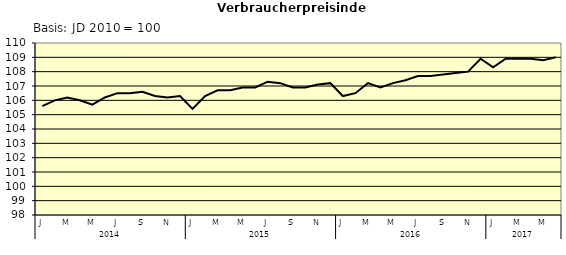
| Category | Series 0 |
|---|---|
| 0 | 105.6 |
| 1 | 106 |
| 2 | 106.2 |
| 3 | 106 |
| 4 | 105.7 |
| 5 | 106.2 |
| 6 | 106.5 |
| 7 | 106.5 |
| 8 | 106.6 |
| 9 | 106.3 |
| 10 | 106.2 |
| 11 | 106.3 |
| 12 | 105.4 |
| 13 | 106.3 |
| 14 | 106.7 |
| 15 | 106.7 |
| 16 | 106.9 |
| 17 | 106.9 |
| 18 | 107.3 |
| 19 | 107.2 |
| 20 | 106.9 |
| 21 | 106.9 |
| 22 | 107.1 |
| 23 | 107.2 |
| 24 | 106.3 |
| 25 | 106.5 |
| 26 | 107.2 |
| 27 | 106.9 |
| 28 | 107.2 |
| 29 | 107.4 |
| 30 | 107.7 |
| 31 | 107.7 |
| 32 | 107.8 |
| 33 | 107.9 |
| 34 | 108 |
| 35 | 108.9 |
| 36 | 108.3 |
| 37 | 108.9 |
| 38 | 108.9 |
| 39 | 108.9 |
| 40 | 108.8 |
| 41 | 109 |